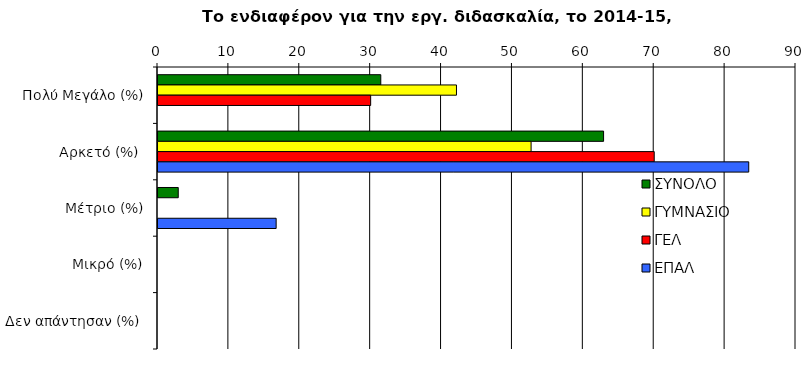
| Category | ΣΥΝΟΛΟ | ΓΥΜΝΑΣΙΟ | ΓΕΛ | ΕΠΑΛ |
|---|---|---|---|---|
| Πολύ Μεγάλο (%) | 31.429 | 42.105 | 30 | 0 |
| Αρκετό (%) | 62.857 | 52.632 | 70 | 83.333 |
| Μέτριο (%) | 2.857 | 0 | 0 | 16.667 |
| Μικρό (%) | 0 | 0 | 0 | 0 |
|  Δεν απάντησαν (%)  | 0 | 0 | 0 | 0 |